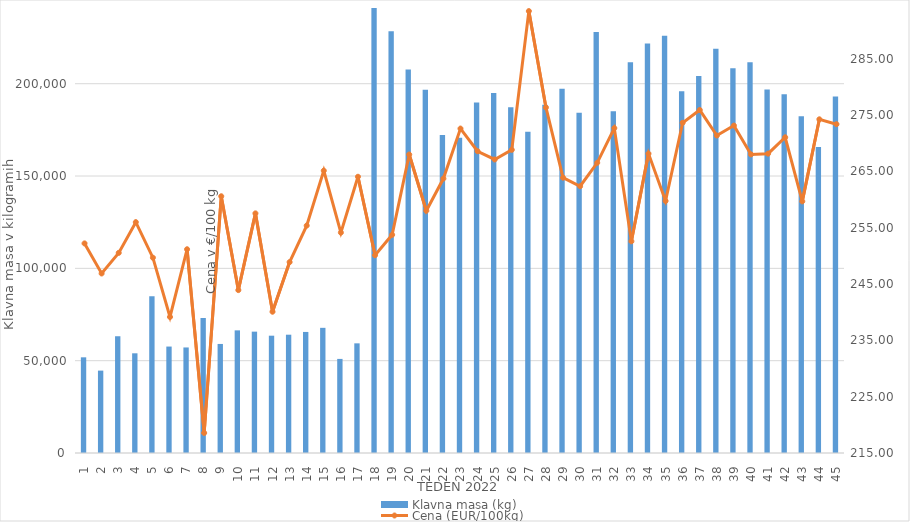
| Category | Klavna masa (kg) |
|---|---|
| 1.0 | 51818 |
| 2.0 | 44619 |
| 3.0 | 63233 |
| 4.0 | 53993 |
| 5.0 | 84871 |
| 6.0 | 57648 |
| 7.0 | 57159 |
| 8.0 | 73139 |
| 9.0 | 59056 |
| 10.0 | 66417 |
| 11.0 | 65723 |
| 12.0 | 63530 |
| 13.0 | 64069 |
| 14.0 | 65564 |
| 15.0 | 67787 |
| 16.0 | 50958 |
| 17.0 | 59387 |
| 18.0 | 241833 |
| 19.0 | 228389 |
| 20.0 | 207661 |
| 21.0 | 196732 |
| 22.0 | 172190 |
| 23.0 | 170751 |
| 24.0 | 189775 |
| 25.0 | 195029 |
| 26.0 | 187239 |
| 27.0 | 173967 |
| 28.0 | 188601 |
| 29.0 | 197293 |
| 30.0 | 184259 |
| 31.0 | 228023 |
| 32.0 | 185079 |
| 33.0 | 211612 |
| 34.0 | 221748 |
| 35.0 | 225927 |
| 36.0 | 195924 |
| 37.0 | 204224 |
| 38.0 | 218966 |
| 39.0 | 208403 |
| 40.0 | 211635 |
| 41.0 | 196841 |
| 42.0 | 194271 |
| 43.0 | 182399 |
| 44.0 | 165696 |
| 45.0 | 193022 |